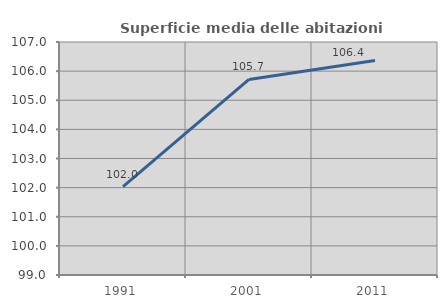
| Category | Superficie media delle abitazioni occupate |
|---|---|
| 1991.0 | 102.033 |
| 2001.0 | 105.716 |
| 2011.0 | 106.364 |